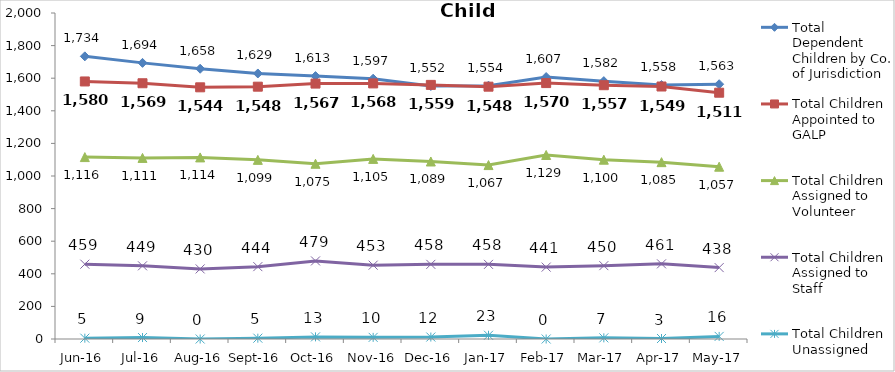
| Category | Total Dependent Children by Co. of Jurisdiction | Total Children Appointed to GALP | Total Children Assigned to Volunteer | Total Children Assigned to Staff | Total Children Unassigned |
|---|---|---|---|---|---|
| Jun-16 | 1734 | 1580 | 1116 | 459 | 5 |
| Jul-16 | 1694 | 1569 | 1111 | 449 | 9 |
| Aug-16 | 1658 | 1544 | 1114 | 430 | 0 |
| Sep-16 | 1629 | 1548 | 1099 | 444 | 5 |
| Oct-16 | 1613 | 1567 | 1075 | 479 | 13 |
| Nov-16 | 1597 | 1568 | 1105 | 453 | 10 |
| Dec-16 | 1552 | 1559 | 1089 | 458 | 12 |
| Jan-17 | 1554 | 1548 | 1067 | 458 | 23 |
| Feb-17 | 1607 | 1570 | 1129 | 441 | 0 |
| Mar-17 | 1582 | 1557 | 1100 | 450 | 7 |
| Apr-17 | 1558 | 1549 | 1085 | 461 | 3 |
| May-17 | 1563 | 1511 | 1057 | 438 | 16 |